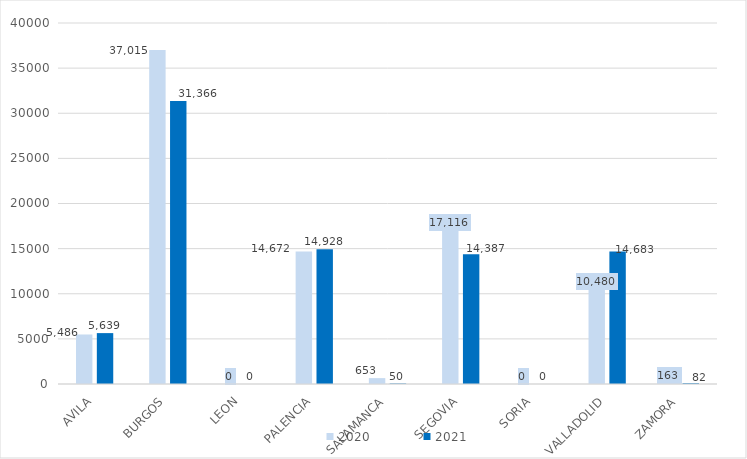
| Category | 2020 | 2021 |
|---|---|---|
| AVILA | 5486.357 | 5639.029 |
| BURGOS | 37015.279 | 31365.673 |
| LEON | 0 | 0 |
| PALENCIA | 14671.603 | 14927.804 |
| SALAMANCA | 653.019 | 50.374 |
| SEGOVIA | 17115.979 | 14387.135 |
| SORIA | 0 | 0.032 |
| VALLADOLID | 10480.462 | 14682.766 |
| ZAMORA | 163 | 81.855 |